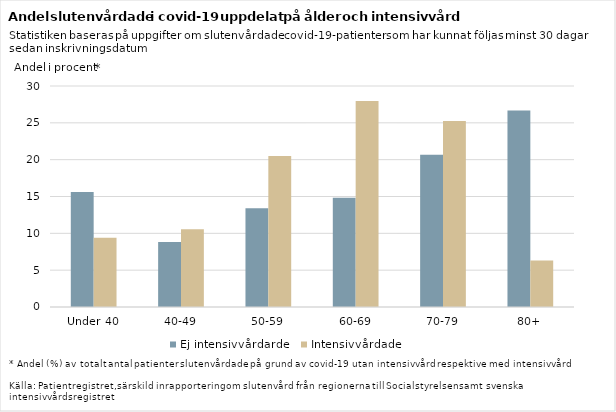
| Category | Ej intensivvårdarde | Intensivvårdade |
|---|---|---|
| Under 40 | 15.6 | 9.39 |
| 40-49 | 8.82 | 10.56 |
| 50-59 | 13.41 | 20.51 |
| 60-69 | 14.84 | 27.97 |
| 70-79 | 20.66 | 25.24 |
| 80+ | 26.68 | 6.32 |